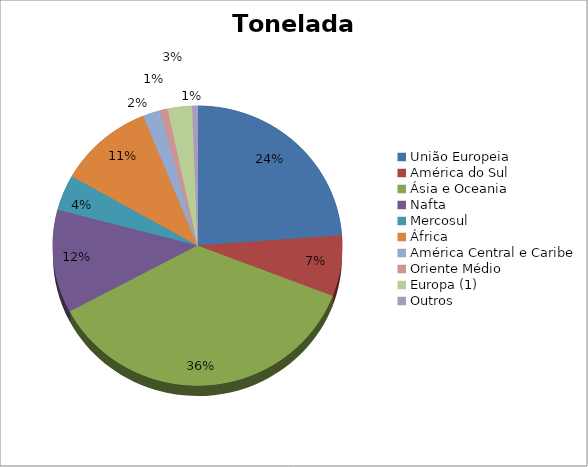
| Category | Series 0 |
|---|---|
| União Europeia | 1309112.716 |
| América do Sul | 387811.081 |
| Ásia e Oceania | 1998031.512 |
| Nafta | 656145.717 |
| Mercosul | 226421.532 |
| África | 584178.841 |
| América Central e Caribe | 107357.572 |
| Oriente Médio | 46795.122 |
| Europa (1) | 150075.284 |
| Outros | 32472.772 |